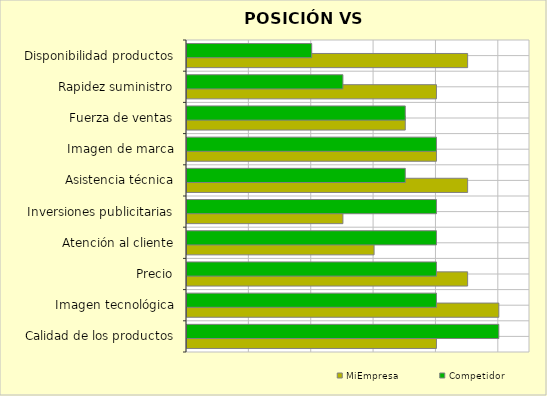
| Category | MiEmpresa | Competidor |
|---|---|---|
| Calidad de los productos | 8 | 10 |
| Imagen tecnológica | 10 | 8 |
| Precio | 9 | 8 |
| Atención al cliente | 6 | 8 |
| Inversiones publicitarias | 5 | 8 |
| Asistencia técnica | 9 | 7 |
| Imagen de marca | 8 | 8 |
| Fuerza de ventas | 7 | 7 |
| Rapidez suministro | 8 | 5 |
| Disponibilidad productos | 9 | 4 |